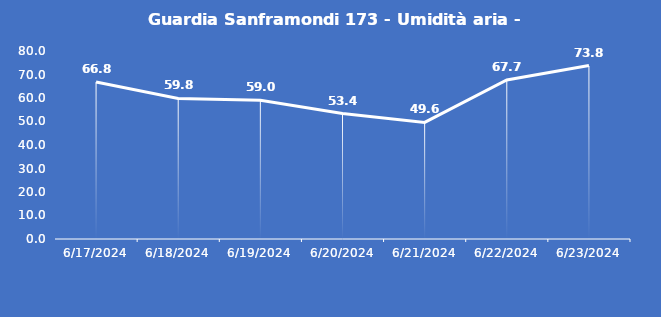
| Category | Guardia Sanframondi 173 - Umidità aria - Grezzo (%) |
|---|---|
| 6/17/24 | 66.8 |
| 6/18/24 | 59.8 |
| 6/19/24 | 59 |
| 6/20/24 | 53.4 |
| 6/21/24 | 49.6 |
| 6/22/24 | 67.7 |
| 6/23/24 | 73.8 |